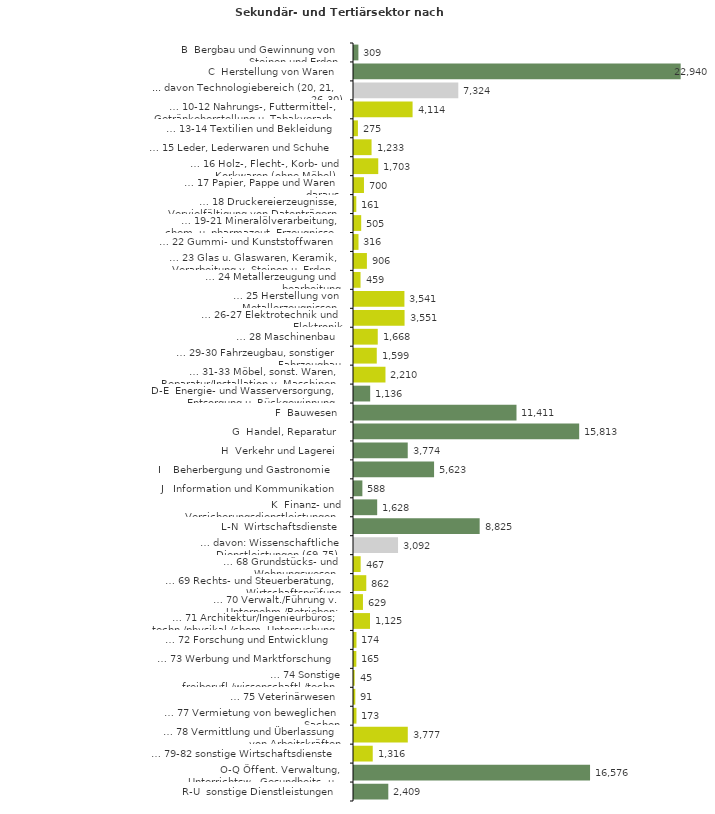
| Category | Series 0 |
|---|---|
| B  Bergbau und Gewinnung von Steinen und Erden | 309 |
| C  Herstellung von Waren | 22940 |
| ... davon Technologiebereich (20, 21, 26-30) | 7324 |
| … 10-12 Nahrungs-, Futtermittel-, Getränkeherstellung u. Tabakverarb. | 4114 |
| … 13-14 Textilien und Bekleidung | 275 |
| … 15 Leder, Lederwaren und Schuhe | 1233 |
| … 16 Holz-, Flecht-, Korb- und Korkwaren (ohne Möbel)  | 1703 |
| … 17 Papier, Pappe und Waren daraus  | 700 |
| … 18 Druckereierzeugnisse, Vervielfältigung von Datenträgern | 161 |
| … 19-21 Mineralölverarbeitung, chem. u. pharmazeut. Erzeugnisse | 505 |
| … 22 Gummi- und Kunststoffwaren | 316 |
| … 23 Glas u. Glaswaren, Keramik, Verarbeitung v. Steinen u. Erden  | 906 |
| … 24 Metallerzeugung und -bearbeitung | 459 |
| … 25 Herstellung von Metallerzeugnissen  | 3541 |
| … 26-27 Elektrotechnik und Elektronik | 3551 |
| … 28 Maschinenbau | 1668 |
| … 29-30 Fahrzeugbau, sonstiger Fahrzeugbau | 1599 |
| … 31-33 Möbel, sonst. Waren, Reparatur/Installation v. Maschinen | 2210 |
| D-E  Energie- und Wasserversorgung, Entsorgung u. Rückgewinnung | 1136 |
| F  Bauwesen | 11411 |
| G  Handel, Reparatur | 15813 |
| H  Verkehr und Lagerei | 3774 |
| I    Beherbergung und Gastronomie | 5623 |
| J   Information und Kommunikation | 588 |
| K  Finanz- und Versicherungsdienstleistungen | 1628 |
| L-N  Wirtschaftsdienste | 8825 |
| … davon: Wissenschaftliche Dienstleistungen (69-75) | 3092 |
| … 68 Grundstücks- und Wohnungswesen  | 467 |
| … 69 Rechts- und Steuerberatung, Wirtschaftsprüfung | 862 |
| … 70 Verwalt./Führung v. Unternehm./Betrieben; Unternehmensberat. | 629 |
| … 71 Architektur/Ingenieurbüros; techn./physikal./chem. Untersuchung | 1125 |
| … 72 Forschung und Entwicklung  | 174 |
| … 73 Werbung und Marktforschung | 165 |
| … 74 Sonstige freiberufl./wissenschaftl./techn. Tätigkeiten | 45 |
| … 75 Veterinärwesen | 91 |
| … 77 Vermietung von beweglichen Sachen  | 173 |
| … 78 Vermittlung und Überlassung von Arbeitskräften | 3777 |
| … 79-82 sonstige Wirtschaftsdienste | 1316 |
| O-Q Öffent. Verwaltung, Unterrichtsw., Gesundheits- u. Sozialwesen | 16576 |
| R-U  sonstige Dienstleistungen | 2409 |